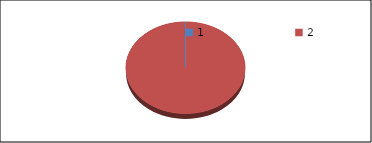
| Category | Series1 |
|---|---|
| 0 | 0 |
| 1 | 185.2 |